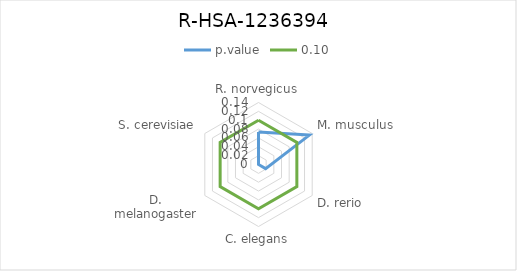
| Category | p.value | 0.10 |
|---|---|---|
| R. norvegicus | 0.073 | 0.1 |
| M. musculus | 0.133 | 0.1 |
| D. rerio | 0.019 | 0.1 |
| C. elegans | 0 | 0.1 |
| D. melanogaster | 0 | 0.1 |
| S. cerevisiae | 0 | 0.1 |